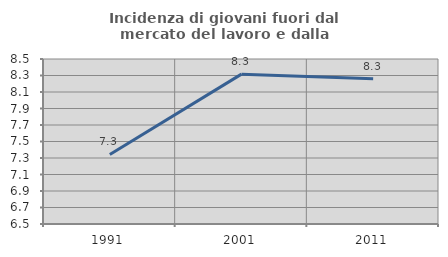
| Category | Incidenza di giovani fuori dal mercato del lavoro e dalla formazione  |
|---|---|
| 1991.0 | 7.343 |
| 2001.0 | 8.316 |
| 2011.0 | 8.262 |